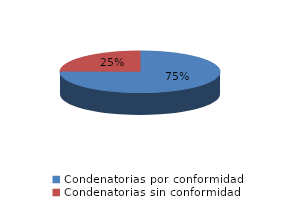
| Category | Series 0 |
|---|---|
| 0 | 1043 |
| 1 | 345 |